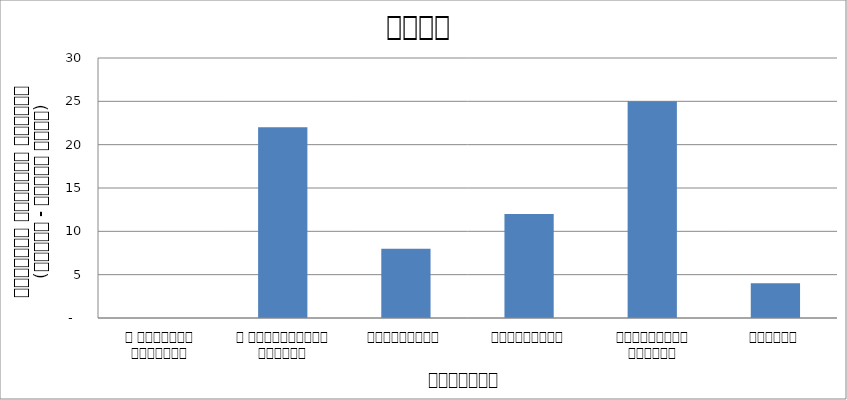
| Category | अन्य |
|---|---|
| द हिमालयन टाइम्स् | 0 |
| द काठमाण्डौं पोस्ट् | 22 |
| रिपब्लिका | 8 |
| कान्तिपुर | 12 |
| अन्नपूर्ण पोस्ट् | 25 |
| नागरिक | 4 |